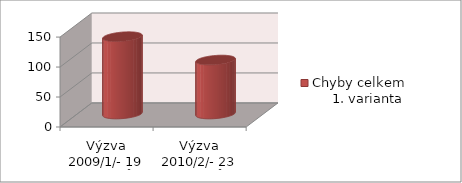
| Category | Chyby celkem                 1. varianta |
|---|---|
| Výzva 2009/1/- 19 projektů | 129 |
| Výzva 2010/2/- 23 projektů  | 90 |